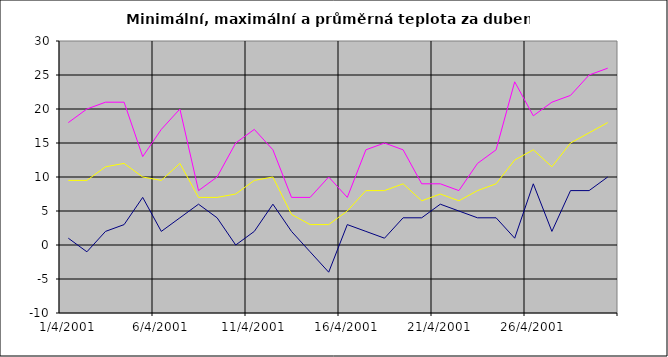
| Category | Series 0 | Series 1 | Series 2 |
|---|---|---|---|
| 2001-04-01 | 1 | 18 | 9.5 |
| 2001-04-02 | -1 | 20 | 9.5 |
| 2001-04-03 | 2 | 21 | 11.5 |
| 2001-04-04 | 3 | 21 | 12 |
| 2001-04-05 | 7 | 13 | 10 |
| 2001-04-06 | 2 | 17 | 9.5 |
| 2001-04-07 | 4 | 20 | 12 |
| 2001-04-08 | 6 | 8 | 7 |
| 2001-04-09 | 4 | 10 | 7 |
| 2001-04-10 | 0 | 15 | 7.5 |
| 2001-04-11 | 2 | 17 | 9.5 |
| 2001-04-12 | 6 | 14 | 10 |
| 2001-04-13 | 2 | 7 | 4.5 |
| 2001-04-14 | -1 | 7 | 3 |
| 2001-04-15 | -4 | 10 | 3 |
| 2001-04-16 | 3 | 7 | 5 |
| 2001-04-17 | 2 | 14 | 8 |
| 2001-04-18 | 1 | 15 | 8 |
| 2001-04-19 | 4 | 14 | 9 |
| 2001-04-20 | 4 | 9 | 6.5 |
| 2001-04-21 | 6 | 9 | 7.5 |
| 2001-04-22 | 5 | 8 | 6.5 |
| 2001-04-23 | 4 | 12 | 8 |
| 2001-04-24 | 4 | 14 | 9 |
| 2001-04-25 | 1 | 24 | 12.5 |
| 2001-04-26 | 9 | 19 | 14 |
| 2001-04-27 | 2 | 21 | 11.5 |
| 2001-04-28 | 8 | 22 | 15 |
| 2001-04-29 | 8 | 25 | 16.5 |
| 2001-04-30 | 10 | 26 | 18 |